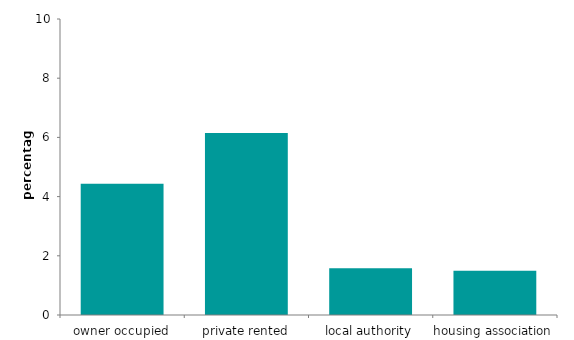
| Category | Series 0 |
|---|---|
| owner occupied | 4.434 |
| private rented | 6.149 |
| local authority | 1.579 |
| housing association | 1.495 |